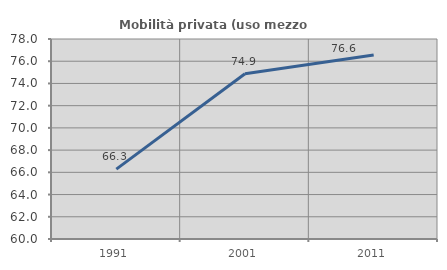
| Category | Mobilità privata (uso mezzo privato) |
|---|---|
| 1991.0 | 66.289 |
| 2001.0 | 74.878 |
| 2011.0 | 76.559 |